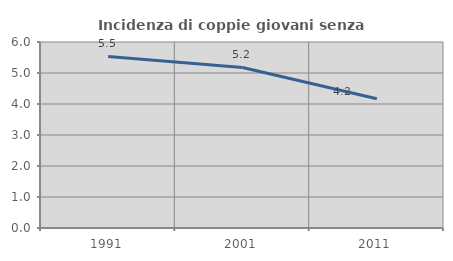
| Category | Incidenza di coppie giovani senza figli |
|---|---|
| 1991.0 | 5.533 |
| 2001.0 | 5.178 |
| 2011.0 | 4.17 |